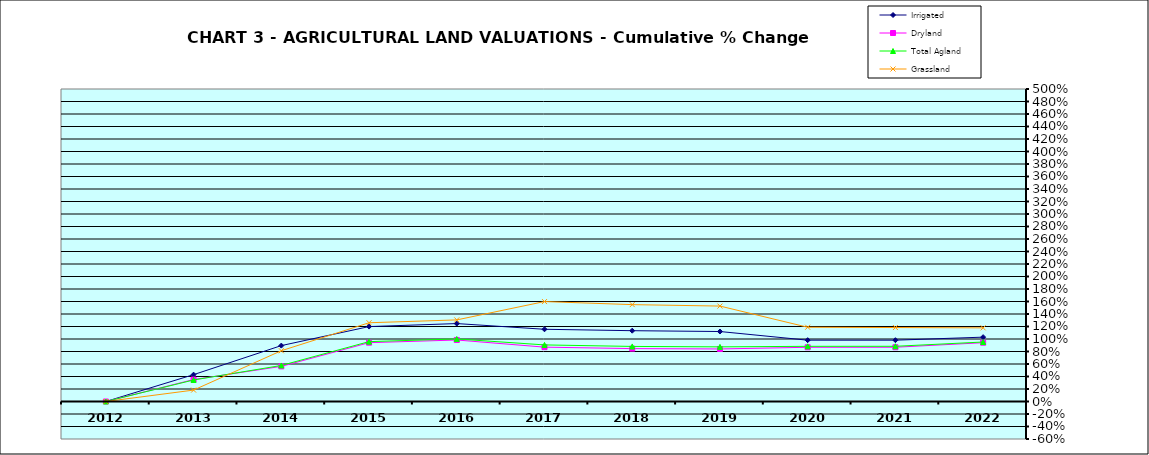
| Category | Irrigated | Dryland | Total Agland | Grassland |
|---|---|---|---|---|
| 2012.0 | 0 | 0 | 0 | 0 |
| 2013.0 | 0.43 | 0.351 | 0.344 | 0.183 |
| 2014.0 | 0.894 | 0.562 | 0.577 | 0.812 |
| 2015.0 | 1.199 | 0.941 | 0.958 | 1.26 |
| 2016.0 | 1.247 | 0.984 | 1.001 | 1.306 |
| 2017.0 | 1.156 | 0.87 | 0.905 | 1.599 |
| 2018.0 | 1.133 | 0.846 | 0.881 | 1.55 |
| 2019.0 | 1.12 | 0.841 | 0.874 | 1.527 |
| 2020.0 | 0.981 | 0.868 | 0.883 | 1.188 |
| 2021.0 | 0.981 | 0.868 | 0.883 | 1.183 |
| 2022.0 | 1.03 | 0.941 | 0.952 | 1.178 |